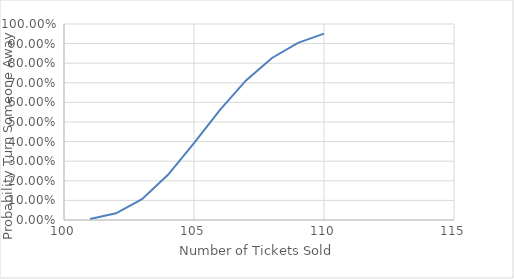
| Category | Probability # Show > Capacity |
|---|---|
| 101.0 | 0.006 |
| 102.0 | 0.034 |
| 103.0 | 0.106 |
| 104.0 | 0.231 |
| 105.0 | 0.392 |
| 106.0 | 0.562 |
| 107.0 | 0.712 |
| 108.0 | 0.827 |
| 109.0 | 0.904 |
| 110.0 | 0.951 |